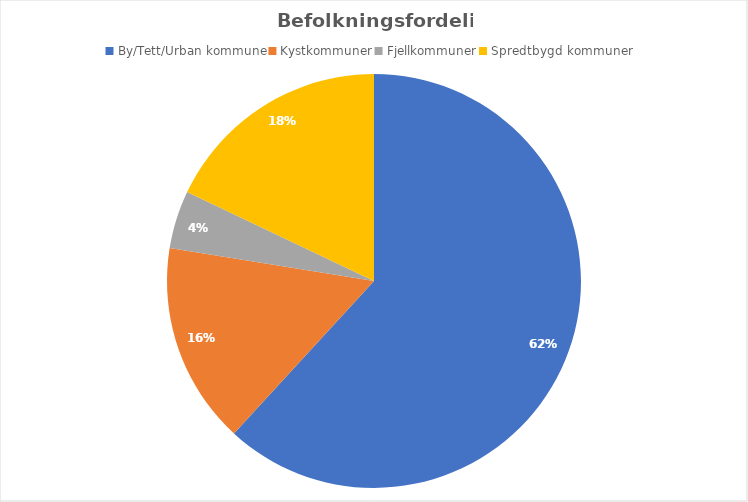
| Category | Series 0 |
|---|---|
| By/Tett/Urban kommune | 298695 |
| Kystkommuner | 75913 |
| Fjellkommuner | 21933 |
| Spredtbygd kommuner | 86579 |